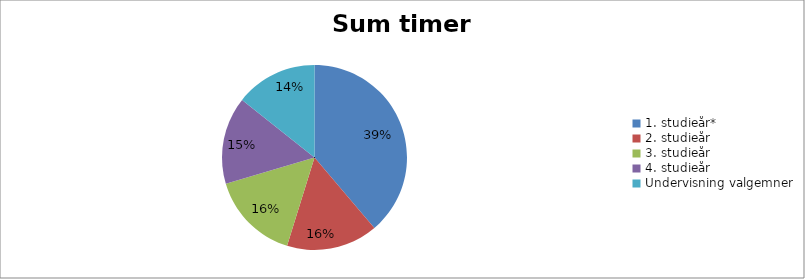
| Category | Sum timer 2021 |
|---|---|
| 1. studieår* | 4035.143 |
| 2. studieår | 1663.586 |
| 3. studieår | 1624.286 |
| 4. studieår | 1589.238 |
| Undervisning valgemner | 1488 |